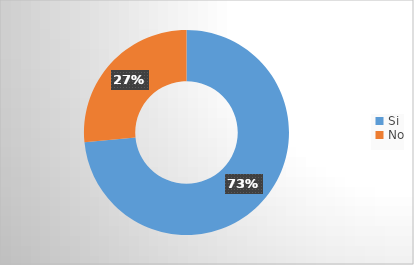
| Category | Series 0 |
|---|---|
| Si | 0.735 |
| No | 0.265 |